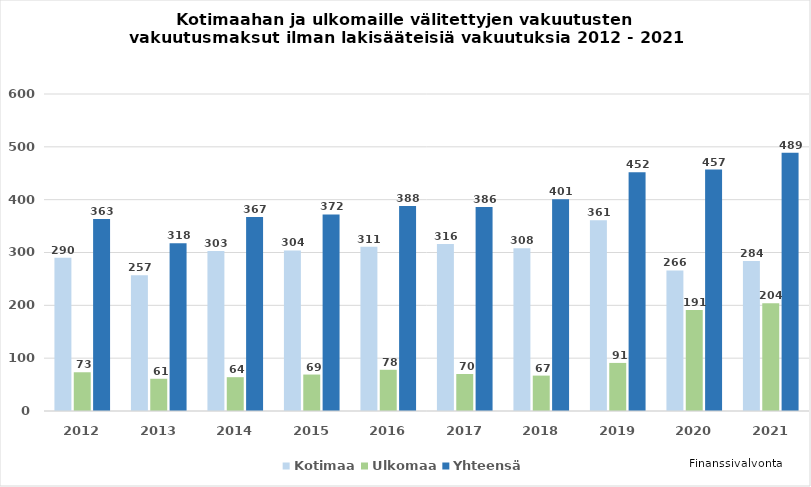
| Category | Kotimaa | Ulkomaa | Yhteensä  |
|---|---|---|---|
| 2012.0 | 289.922 | 73.321 | 363.243 |
| 2013.0 | 257 | 61 | 317.523 |
| 2014.0 | 303 | 64 | 367 |
| 2015.0 | 304 | 69 | 372 |
| 2016.0 | 311 | 78 | 388 |
| 2017.0 | 316 | 70 | 386 |
| 2018.0 | 308 | 67 | 401 |
| 2019.0 | 361 | 91 | 452 |
| 2020.0 | 266 | 191 | 457 |
| 2021.0 | 284 | 204 | 489 |